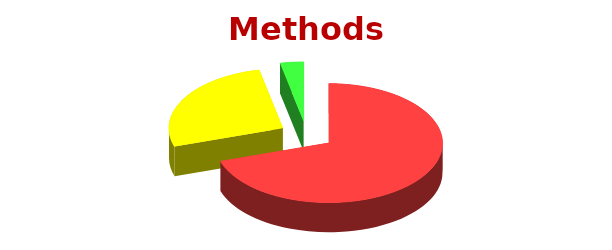
| Category | Methods |
|---|---|
| Unconsciously Incompetent | 21 |
| Consciously Incompetent | 8 |
| Consciously Competent | 1 |